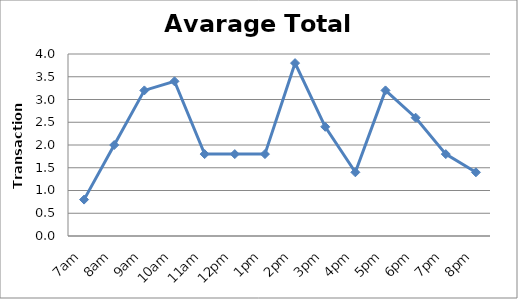
| Category | Series 0 |
|---|---|
| 7am | 0.8 |
| 8am | 2 |
| 9am | 3.2 |
| 10am | 3.4 |
| 11am | 1.8 |
| 12pm | 1.8 |
| 1pm | 1.8 |
| 2pm | 3.8 |
| 3pm | 2.4 |
| 4pm | 1.4 |
| 5pm | 3.2 |
| 6pm | 2.6 |
| 7pm | 1.8 |
| 8pm | 1.4 |